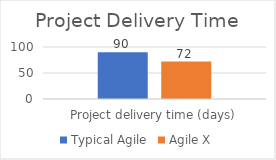
| Category | Typical Agile | Agile X |
|---|---|---|
| Project delivery time (days) | 90 | 72 |